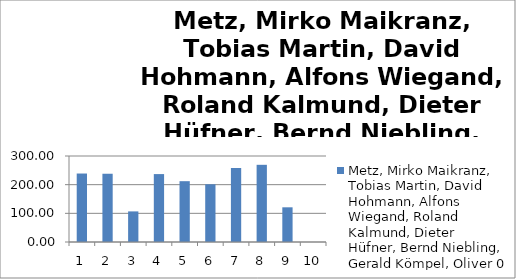
| Category | Metz, Mirko Maikranz, Tobias Martin, David Hohmann, Alfons Wiegand, Roland Kalmund, Dieter Hüfner, Bernd Niebling, Gerald Kömpel, Oliver 0 |
|---|---|
| 0 | 238.87 |
| 1 | 238.1 |
| 2 | 106.75 |
| 3 | 236.92 |
| 4 | 212.15 |
| 5 | 201.34 |
| 6 | 258.15 |
| 7 | 269.27 |
| 8 | 121.01 |
| 9 | 0 |